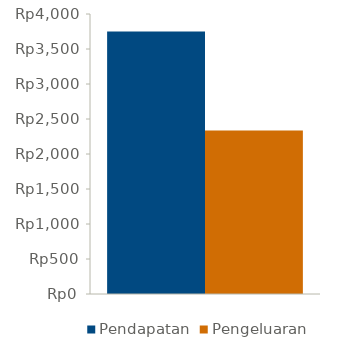
| Category | Pendapatan | Pengeluaran |
|---|---|---|
| 0 | 3750 | 2336 |